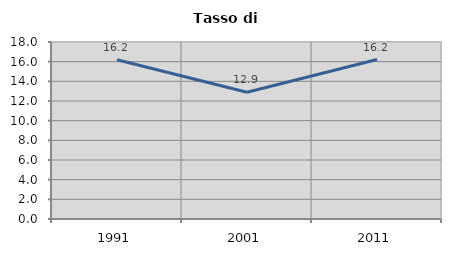
| Category | Tasso di disoccupazione   |
|---|---|
| 1991.0 | 16.193 |
| 2001.0 | 12.891 |
| 2011.0 | 16.216 |